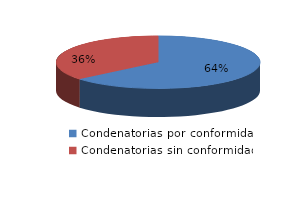
| Category | Series 0 |
|---|---|
| 0 | 69 |
| 1 | 39 |